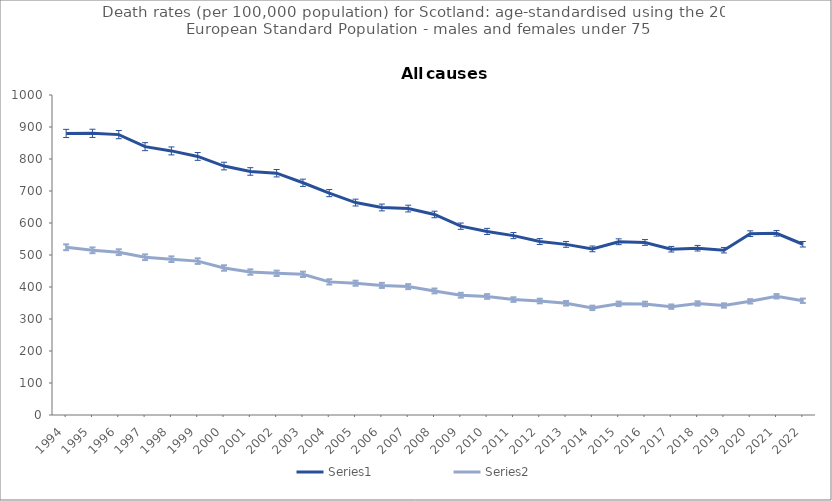
| Category | Series 0 | Series 1 |
|---|---|---|
| 1994.0 | 879.8 | 524.2 |
| 1995.0 | 880.2 | 514.7 |
| 1996.0 | 876.2 | 508.8 |
| 1997.0 | 838.6 | 493 |
| 1998.0 | 825.3 | 486.9 |
| 1999.0 | 808 | 480.9 |
| 2000.0 | 777.9 | 459.4 |
| 2001.0 | 761.1 | 446.7 |
| 2002.0 | 755.6 | 442.8 |
| 2003.0 | 725.7 | 439.6 |
| 2004.0 | 693.4 | 416 |
| 2005.0 | 663.8 | 411.8 |
| 2006.0 | 648.5 | 405 |
| 2007.0 | 645.1 | 401.2 |
| 2008.0 | 626.7 | 387.7 |
| 2009.0 | 590.1 | 374.3 |
| 2010.0 | 573.6 | 370.4 |
| 2011.0 | 560.6 | 360.7 |
| 2012.0 | 542 | 356.2 |
| 2013.0 | 533.2 | 349.2 |
| 2014.0 | 519.1 | 334.8 |
| 2015.0 | 541.4 | 347.3 |
| 2016.0 | 539.2 | 347.1 |
| 2017.0 | 518.1 | 338.6 |
| 2018.0 | 521.2 | 348.5 |
| 2019.0 | 515 | 342.2 |
| 2020.0 | 566.6 | 355.2 |
| 2021.0 | 567.8 | 371 |
| 2022.0 | 533.6 | 357 |